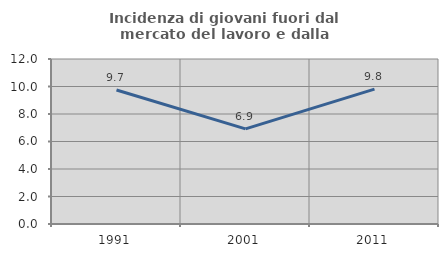
| Category | Incidenza di giovani fuori dal mercato del lavoro e dalla formazione  |
|---|---|
| 1991.0 | 9.747 |
| 2001.0 | 6.918 |
| 2011.0 | 9.813 |